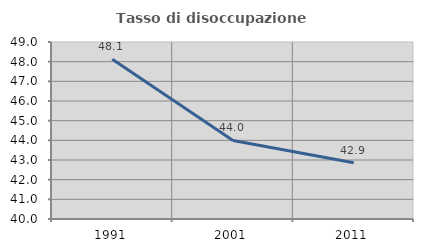
| Category | Tasso di disoccupazione giovanile  |
|---|---|
| 1991.0 | 48.122 |
| 2001.0 | 43.995 |
| 2011.0 | 42.864 |